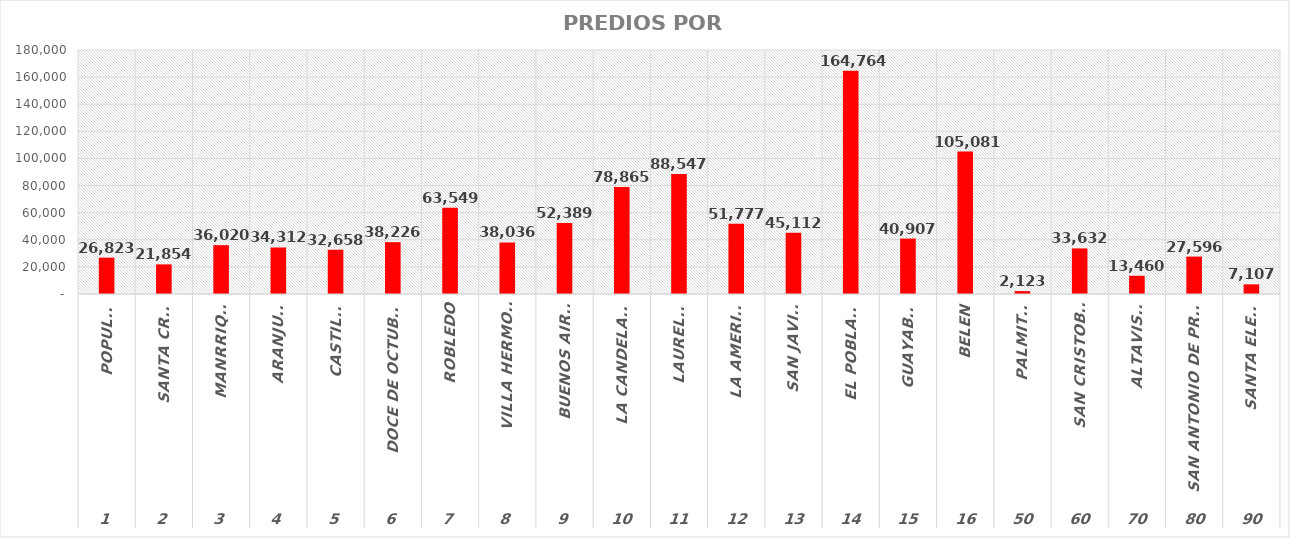
| Category | CuentaDeMatricula |
|---|---|
| 0 | 26823 |
| 1 | 21854 |
| 2 | 36020 |
| 3 | 34312 |
| 4 | 32658 |
| 5 | 38226 |
| 6 | 63549 |
| 7 | 38036 |
| 8 | 52389 |
| 9 | 78865 |
| 10 | 88547 |
| 11 | 51777 |
| 12 | 45112 |
| 13 | 164764 |
| 14 | 40907 |
| 15 | 105081 |
| 16 | 2123 |
| 17 | 33632 |
| 18 | 13460 |
| 19 | 27596 |
| 20 | 7107 |